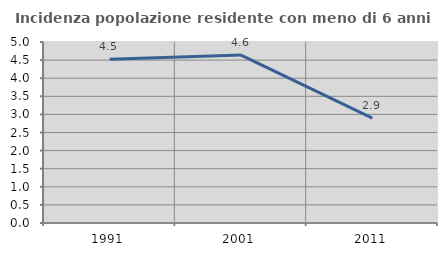
| Category | Incidenza popolazione residente con meno di 6 anni |
|---|---|
| 1991.0 | 4.523 |
| 2001.0 | 4.639 |
| 2011.0 | 2.896 |